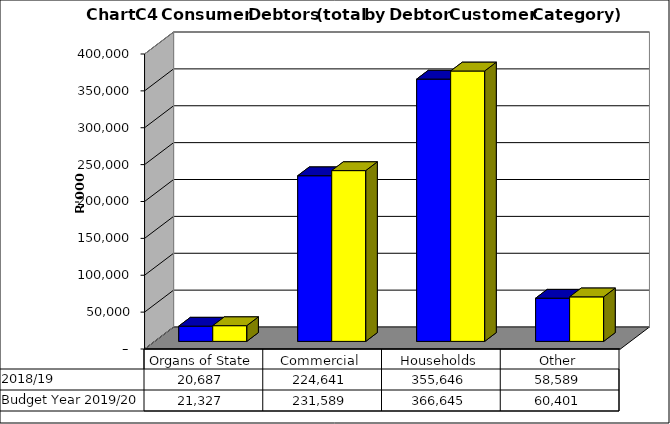
| Category |  2018/19  | Budget Year 2019/20 |
|---|---|---|
| Organs of State | 20687050.427 | 21326856.11 |
| Commercial | 224641244.301 | 231588911.65 |
| Households | 355645728.395 | 366645080.82 |
| Other | 58588549.262 | 60400566.25 |